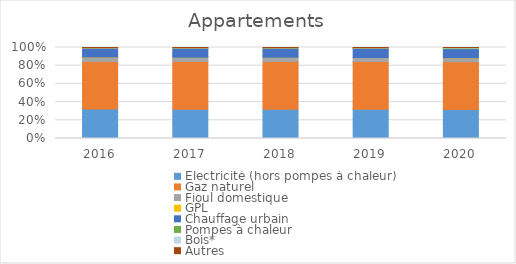
| Category | Electricité (hors pompes à chaleur) | Gaz naturel | Fioul domestique | GPL | Chauffage urbain | Pompes à chaleur | Bois* | Autres |
|---|---|---|---|---|---|---|---|---|
| 2016.0 | 0.324 | 0.522 | 0.049 | 0.001 | 0.095 | 0.004 | 0.004 | 0.002 |
| 2017.0 | 0.323 | 0.522 | 0.048 | 0.001 | 0.097 | 0.004 | 0.004 | 0.002 |
| 2018.0 | 0.322 | 0.523 | 0.046 | 0.001 | 0.098 | 0.004 | 0.004 | 0.002 |
| 2019.0 | 0.321 | 0.525 | 0.045 | 0.001 | 0.098 | 0.005 | 0.004 | 0.001 |
| 2020.0 | 0.318 | 0.526 | 0.041 | 0.001 | 0.101 | 0.007 | 0.004 | 0.001 |